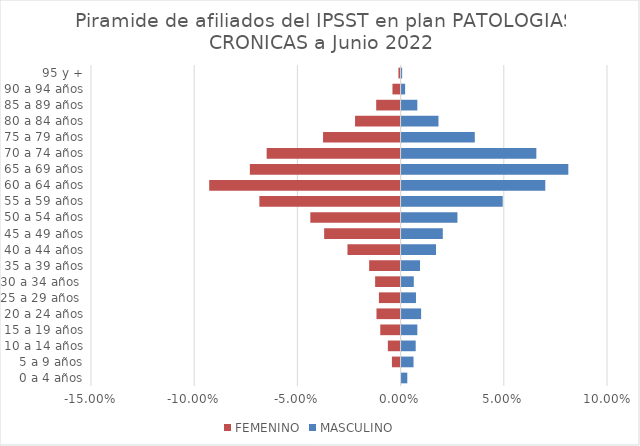
| Category | FEMENINO | MASCULINO |
|---|---|---|
| 0 a 4 años | 0 | 0.003 |
| 5 a 9 años | -0.004 | 0.006 |
| 10 a 14 años | -0.006 | 0.007 |
| 15 a 19 años | -0.01 | 0.008 |
| 20 a 24 años | -0.012 | 0.009 |
| 25 a 29 años  | -0.011 | 0.007 |
| 30 a 34 años  | -0.012 | 0.006 |
| 35 a 39 años | -0.015 | 0.009 |
| 40 a 44 años | -0.026 | 0.017 |
| 45 a 49 años | -0.037 | 0.02 |
| 50 a 54 años | -0.044 | 0.027 |
| 55 a 59 años | -0.068 | 0.049 |
| 60 a 64 años | -0.093 | 0.07 |
| 65 a 69 años | -0.073 | 0.081 |
| 70 a 74 años | -0.065 | 0.065 |
| 75 a 79 años | -0.038 | 0.035 |
| 80 a 84 años | -0.022 | 0.018 |
| 85 a 89 años | -0.012 | 0.008 |
| 90 a 94 años | -0.004 | 0.002 |
| 95 y + | -0.001 | 0 |